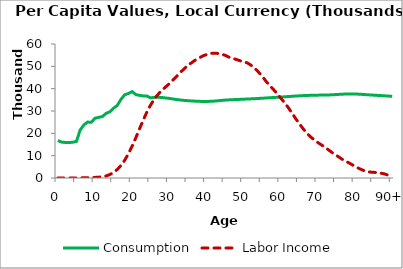
| Category | Consumption | Labor Income |
|---|---|---|
| 0 | 16796.941 | 0 |
|  | 16070.02 | 0 |
| 2 | 15921.598 | 0.647 |
| 3 | 15882.704 | 1.337 |
| 4 | 16014.784 | 2.279 |
| 5 | 16376.743 | 9.728 |
| 6 | 21495.885 | 49.217 |
| 7 | 23758.341 | 102.864 |
| 8 | 25039.696 | 155.769 |
| 9 | 24959.772 | 202.377 |
| 10 | 26754.894 | 261.798 |
| 11 | 27147.094 | 365.282 |
| 12 | 27529.522 | 556.777 |
| 13 | 28970.313 | 920.05 |
| 14 | 29640.52 | 1549.588 |
| 15 | 31251.531 | 2497.636 |
| 16 | 32504.601 | 3833.763 |
| 17 | 35245.722 | 5641.11 |
| 18 | 37289.4 | 7973.294 |
| 19 | 37819.306 | 10874.611 |
| 20 | 38671.633 | 14269.07 |
| 21 | 37353.112 | 18035.78 |
| 22 | 36990.217 | 22064.623 |
| 23 | 36758.702 | 25992.815 |
| 24 | 36683.263 | 29642.252 |
| 25 | 35872.354 | 32756.916 |
| 26 | 36117.869 | 35426.163 |
| 27 | 36177.907 | 37494.625 |
| 28 | 36043.383 | 39266.261 |
| 29 | 35839.651 | 40736.574 |
| 30 | 35632.651 | 42224.345 |
| 31 | 35366.282 | 43883.027 |
| 32 | 35131.033 | 45590.416 |
| 33 | 34918.466 | 47310.214 |
| 34 | 34741.58 | 48874.913 |
| 35 | 34615.638 | 50446.136 |
| 36 | 34493.212 | 51615.114 |
| 37 | 34411.895 | 52781.673 |
| 38 | 34335.785 | 53697.618 |
| 39 | 34277.452 | 54645.221 |
| 40 | 34272.816 | 55254.243 |
| 41 | 34330.448 | 55799.056 |
| 42 | 34424.023 | 55906.28 |
| 43 | 34558.707 | 55788.139 |
| 44 | 34738.556 | 55456.469 |
| 45 | 34874.34 | 54958.205 |
| 46 | 34980.5 | 54171.82 |
| 47 | 35061.064 | 53613.963 |
| 48 | 35149.81 | 53106.497 |
| 49 | 35207.884 | 52534.271 |
| 50 | 35279.983 | 51936.541 |
| 51 | 35359.091 | 51564.24 |
| 52 | 35436.171 | 50521.35 |
| 53 | 35516.099 | 49125.111 |
| 54 | 35619.375 | 47444.969 |
| 55 | 35721.391 | 45694.755 |
| 56 | 35820.54 | 43370.758 |
| 57 | 35929.273 | 41497.797 |
| 58 | 36044.374 | 39705.778 |
| 59 | 36128.753 | 37880.029 |
| 60 | 36235.881 | 35776.497 |
| 61 | 36351.65 | 33811.426 |
| 62 | 36465.905 | 31581.286 |
| 63 | 36578.56 | 29161.392 |
| 64 | 36703.005 | 26655.645 |
| 65 | 36790.217 | 24370.363 |
| 66 | 36881.64 | 22114.683 |
| 67 | 36956.435 | 20115.638 |
| 68 | 37017.185 | 18468.468 |
| 69 | 37059.891 | 17135.038 |
| 70 | 37099.734 | 15867.609 |
| 71 | 37128.799 | 14779.955 |
| 72 | 37167.806 | 13690.402 |
| 73 | 37193.076 | 12425.748 |
| 74 | 37281.141 | 11199.724 |
| 75 | 37377.95 | 10127.833 |
| 76 | 37474.788 | 8990.797 |
| 77 | 37563.145 | 7932.374 |
| 78 | 37656 | 7078.86 |
| 79 | 37644.682 | 6191.549 |
| 80 | 37612.305 | 5171.29 |
| 81 | 37537.951 | 4334.84 |
| 82 | 37434.468 | 3574.667 |
| 83 | 37305.878 | 2979.138 |
| 84 | 37204.878 | 2657.525 |
| 85 | 37101.703 | 2554.226 |
| 86 | 36997.667 | 2380.003 |
| 87 | 36893.488 | 2160.827 |
| 88 | 36788.861 | 1798.166 |
| 89 | 36683.865 | 1231.395 |
| 90+ | 36578.869 | 664.626 |